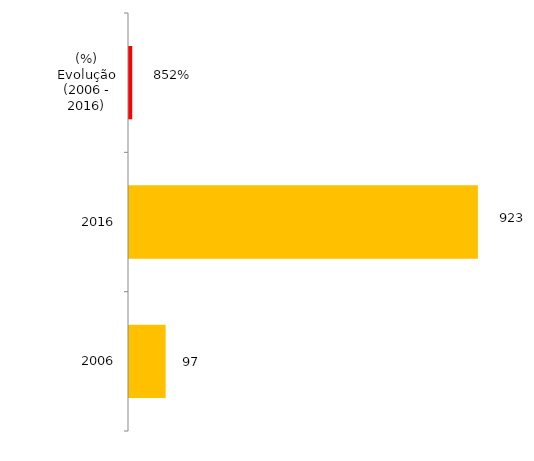
| Category | Téc. Adm. |
|---|---|
| 2006 | 97 |
| 2016 | 923 |
| (%) Evolução (2006 - 2016) | 8.515 |